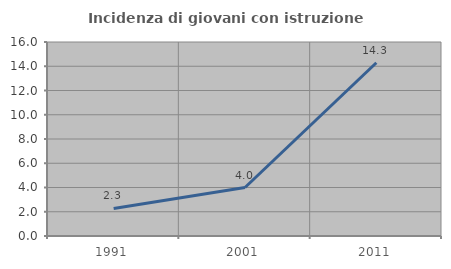
| Category | Incidenza di giovani con istruzione universitaria |
|---|---|
| 1991.0 | 2.273 |
| 2001.0 | 4 |
| 2011.0 | 14.286 |